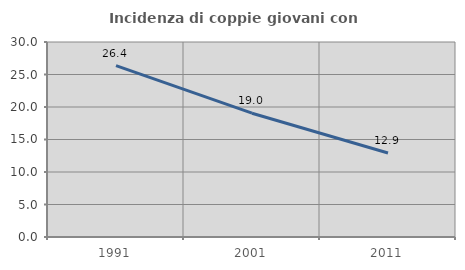
| Category | Incidenza di coppie giovani con figli |
|---|---|
| 1991.0 | 26.377 |
| 2001.0 | 19.048 |
| 2011.0 | 12.916 |